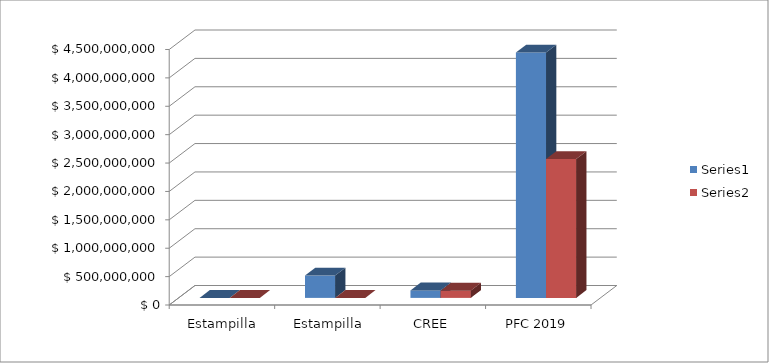
| Category | Series 0 | Series 1 |
|---|---|---|
| Estampilla Unillanos  | 0 | 0 |
| Estampilla Nacional | 393057218 | 0 |
| CREE | 131718615 | 127991895 |
| PFC 2019 | 4321100938 | 2444350244 |